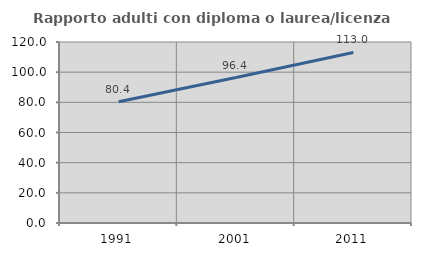
| Category | Rapporto adulti con diploma o laurea/licenza media  |
|---|---|
| 1991.0 | 80.357 |
| 2001.0 | 96.429 |
| 2011.0 | 113.043 |